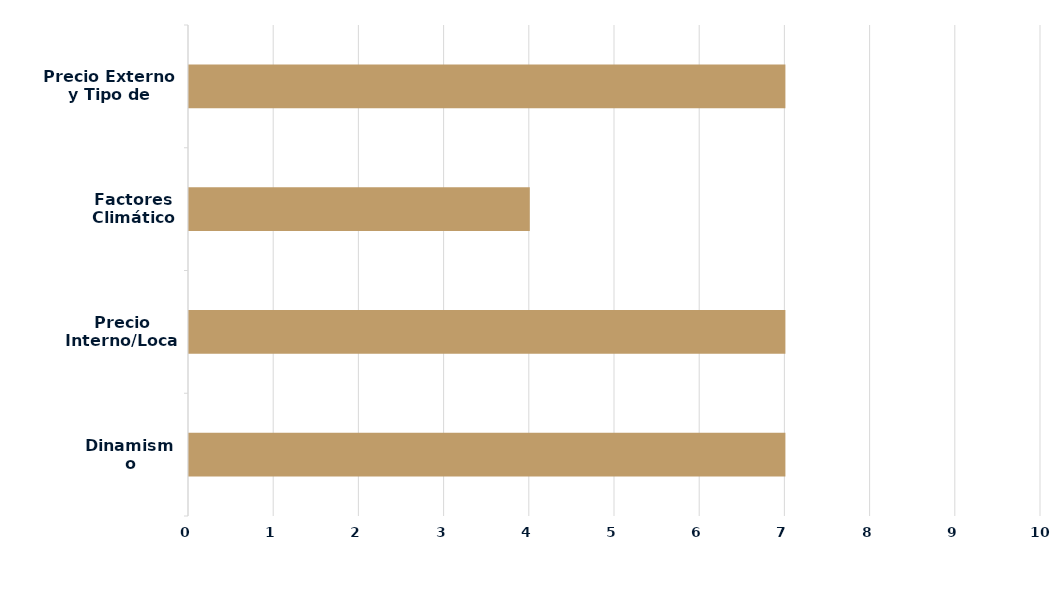
| Category | Series 0 |
|---|---|
| Dinamismo Demanda | 7 |
| Precio Interno/Local | 7 |
| Factores Climáticos | 4 |
| Precio Externo y Tipo de Cambio | 7 |